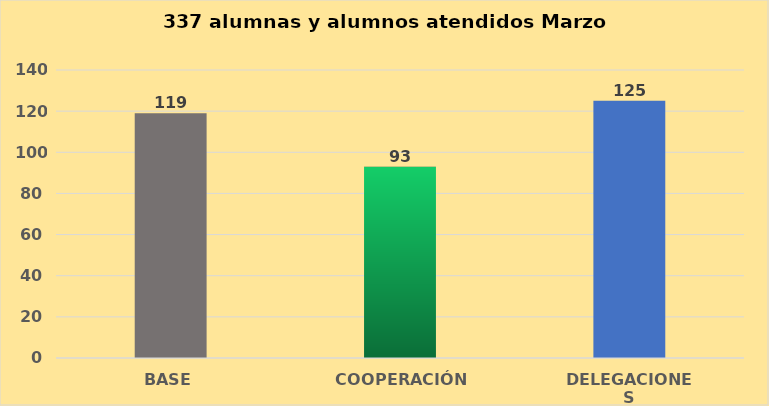
| Category | Series 0 |
|---|---|
| BASE | 119 |
| COOPERACIÓN | 93 |
| DELEGACIONES | 125 |